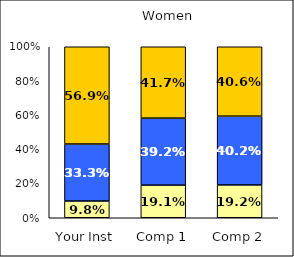
| Category | Low Social Agency | Average Social Agency | High Social Agency |
|---|---|---|---|
| Your Inst | 0.098 | 0.333 | 0.569 |
| Comp 1 | 0.191 | 0.392 | 0.417 |
| Comp 2 | 0.192 | 0.402 | 0.406 |